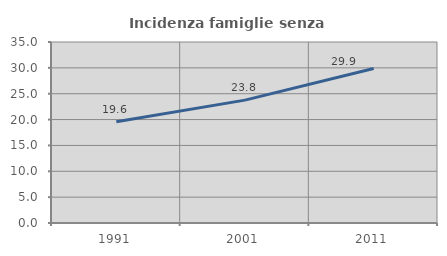
| Category | Incidenza famiglie senza nuclei |
|---|---|
| 1991.0 | 19.575 |
| 2001.0 | 23.763 |
| 2011.0 | 29.887 |